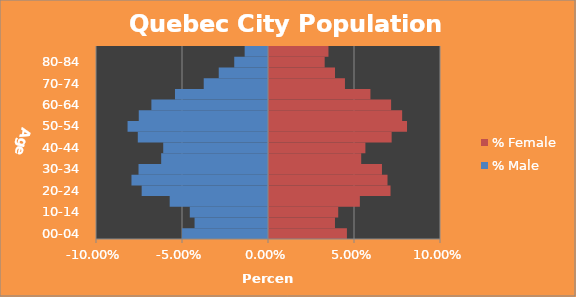
| Category | % Male | % Female |
|---|---|---|
| 00-04 | -0.05 | 0.045 |
| 05-09 | -0.043 | 0.038 |
| 10-14 | -0.045 | 0.04 |
| 15-19 | -0.057 | 0.053 |
| 20-24 | -0.073 | 0.071 |
| 25-29 | -0.079 | 0.069 |
| 30-34 | -0.075 | 0.066 |
| 35-39 | -0.062 | 0.054 |
| 40-44 | -0.061 | 0.056 |
| 45-49 | -0.076 | 0.071 |
| 50-54 | -0.082 | 0.08 |
| 55-59 | -0.075 | 0.077 |
| 60-64 | -0.068 | 0.071 |
| 65-69 | -0.054 | 0.059 |
| 70-74 | -0.037 | 0.044 |
| 75-79 | -0.029 | 0.038 |
| 80-84 | -0.02 | 0.032 |
| 85+ | -0.014 | 0.035 |